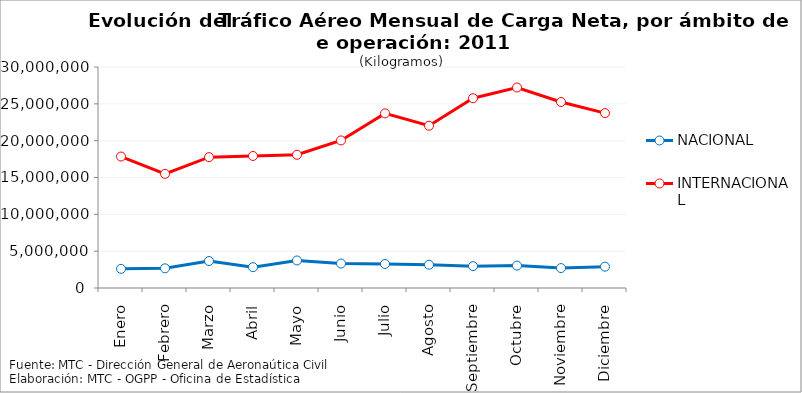
| Category | NACIONAL | INTERNACIONAL |
|---|---|---|
| Enero | 2599368 | 17845964 |
| Febrero | 2673591 | 15496927 |
| Marzo | 3661311 | 17763181 |
| Abril | 2827633 | 17921490 |
| Mayo | 3738079 | 18086824 |
| Junio | 3323147 | 20031720 |
| Julio | 3262658 | 23704717 |
| Agosto | 3158984 | 22026517 |
| Septiembre | 2966260 | 25758138 |
| Octubre | 3038976 | 27219235 |
| Noviembre | 2704486 | 25250952 |
| Diciembre | 2896978 | 23742585 |